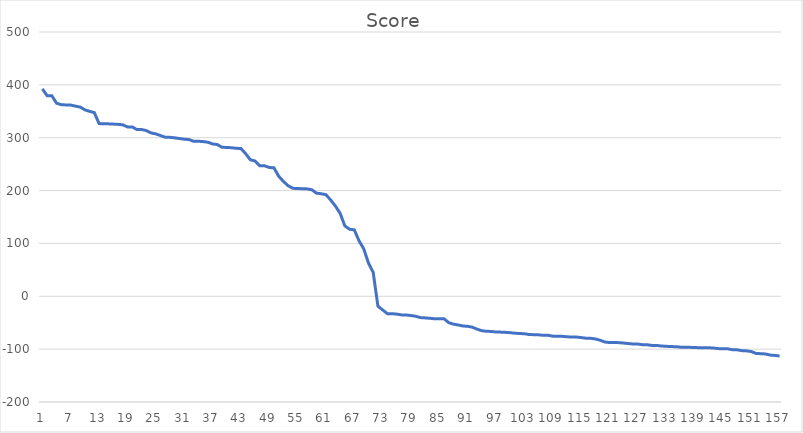
| Category | Score   |
|---|---|
| 0 | 392.4 |
| 1 | 379.6 |
| 2 | 379.5 |
| 3 | 365.3 |
| 4 | 362.5 |
| 5 | 362 |
| 6 | 361.8 |
| 7 | 359.7 |
| 8 | 358 |
| 9 | 352.7 |
| 10 | 349.9 |
| 11 | 347.4 |
| 12 | 326.7 |
| 13 | 326.3 |
| 14 | 326.2 |
| 15 | 325.8 |
| 16 | 325.3 |
| 17 | 324.4 |
| 18 | 320.5 |
| 19 | 320.5 |
| 20 | 315.5 |
| 21 | 315.5 |
| 22 | 313.5 |
| 23 | 309.1 |
| 24 | 307.2 |
| 25 | 304 |
| 26 | 301 |
| 27 | 300.7 |
| 28 | 299.8 |
| 29 | 298.4 |
| 30 | 297.2 |
| 31 | 296.6 |
| 32 | 293.3 |
| 33 | 293.3 |
| 34 | 292.7 |
| 35 | 291.5 |
| 36 | 288.2 |
| 37 | 287.1 |
| 38 | 281.9 |
| 39 | 281.6 |
| 40 | 281.1 |
| 41 | 279.9 |
| 42 | 279.7 |
| 43 | 269.9 |
| 44 | 258.3 |
| 45 | 255.9 |
| 46 | 247 |
| 47 | 247 |
| 48 | 243.7 |
| 49 | 243.1 |
| 50 | 227.2 |
| 51 | 217.3 |
| 52 | 209.1 |
| 53 | 204.3 |
| 54 | 203.8 |
| 55 | 203.6 |
| 56 | 203.2 |
| 57 | 201.6 |
| 58 | 195.1 |
| 59 | 194 |
| 60 | 192.2 |
| 61 | 182.2 |
| 62 | 170.8 |
| 63 | 157.1 |
| 64 | 133.2 |
| 65 | 126.8 |
| 66 | 125.7 |
| 67 | 105.1 |
| 68 | 89.7 |
| 69 | 62.8 |
| 70 | 45.3 |
| 71 | -18.7 |
| 72 | -25.8 |
| 73 | -32.9 |
| 74 | -32.9 |
| 75 | -33.8 |
| 76 | -35.2 |
| 77 | -35.4 |
| 78 | -36.4 |
| 79 | -37.8 |
| 80 | -40.3 |
| 81 | -40.9 |
| 82 | -41.6 |
| 83 | -42.6 |
| 84 | -42.6 |
| 85 | -42.6 |
| 86 | -50 |
| 87 | -52.7 |
| 88 | -54.3 |
| 89 | -56.2 |
| 90 | -56.8 |
| 91 | -58.5 |
| 92 | -62.3 |
| 93 | -65.2 |
| 94 | -66.2 |
| 95 | -66.5 |
| 96 | -67.6 |
| 97 | -67.8 |
| 98 | -68.2 |
| 99 | -68.9 |
| 100 | -69.8 |
| 101 | -70.5 |
| 102 | -70.8 |
| 103 | -72.4 |
| 104 | -72.6 |
| 105 | -72.9 |
| 106 | -73.8 |
| 107 | -73.8 |
| 108 | -75.4 |
| 109 | -75.6 |
| 110 | -75.8 |
| 111 | -76.6 |
| 112 | -77.1 |
| 113 | -77.1 |
| 114 | -78.1 |
| 115 | -79.3 |
| 116 | -79.5 |
| 117 | -80.7 |
| 118 | -83.1 |
| 119 | -86.5 |
| 120 | -87.5 |
| 121 | -87.5 |
| 122 | -87.7 |
| 123 | -88.5 |
| 124 | -89.4 |
| 125 | -90.3 |
| 126 | -90.4 |
| 127 | -91.6 |
| 128 | -91.7 |
| 129 | -93 |
| 130 | -93 |
| 131 | -94.1 |
| 132 | -94.6 |
| 133 | -95.2 |
| 134 | -95.3 |
| 135 | -96.2 |
| 136 | -96.5 |
| 137 | -96.6 |
| 138 | -96.9 |
| 139 | -97.3 |
| 140 | -97.3 |
| 141 | -97.4 |
| 142 | -97.9 |
| 143 | -99 |
| 144 | -99.2 |
| 145 | -99.4 |
| 146 | -101 |
| 147 | -101.3 |
| 148 | -102.8 |
| 149 | -103.3 |
| 150 | -104.5 |
| 151 | -108.1 |
| 152 | -108.6 |
| 153 | -109.1 |
| 154 | -111.2 |
| 155 | -111.9 |
| 156 | -113 |